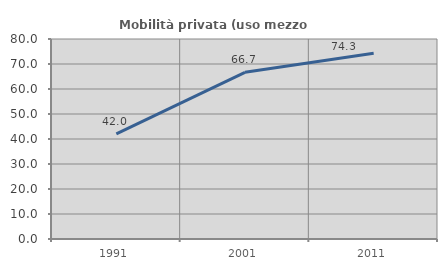
| Category | Mobilità privata (uso mezzo privato) |
|---|---|
| 1991.0 | 42.025 |
| 2001.0 | 66.658 |
| 2011.0 | 74.307 |